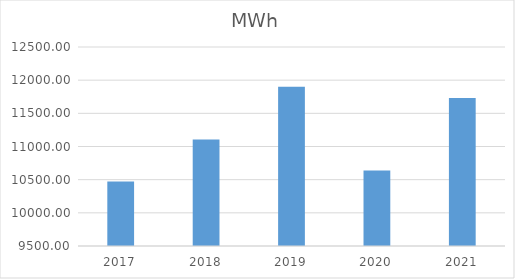
| Category | MWh |
|---|---|
| 2017.0 | 10471.336 |
| 2018.0 | 11104.098 |
| 2019.0 | 11900.462 |
| 2020.0 | 10638.043 |
| 2021.0 | 11730.771 |